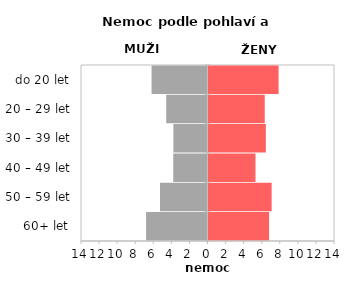
| Category | Nemoc |
|---|---|
| 60+ let | 6.702 |
| 50 – 59 let | 6.987 |
| 40 – 49 let | 5.202 |
| 30 – 39 let | 6.347 |
| 20 – 29 let | 6.226 |
| do 20 let | 7.755 |